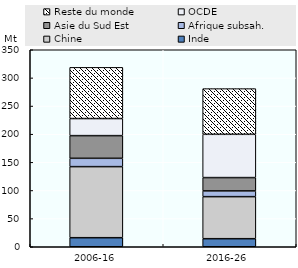
| Category | Inde | Chine | Afrique subsah. | Asie du Sud Est | OCDE | Reste du monde |
|---|---|---|---|---|---|---|
| 2006-16 | 16.096 | 126.239 | 14.812 | 40.273 | 30.367 | 90.929 |
| 2016-26 | 14.298 | 74.722 | 10.217 | 23.649 | 76.881 | 81.183 |